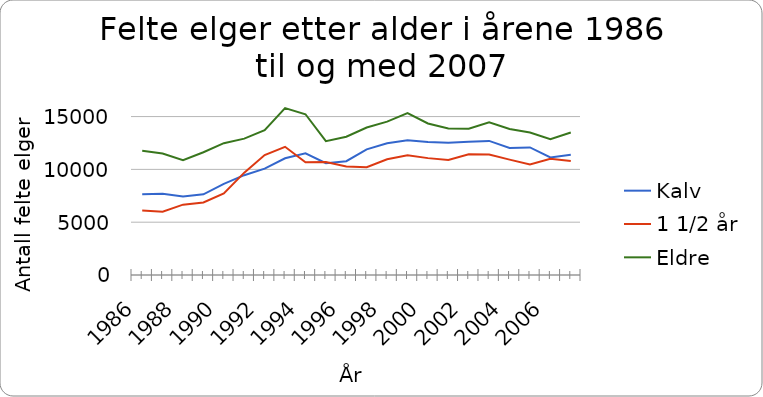
| Category | Kalv | 1 1/2 år | Eldre |
|---|---|---|---|
| 1986.0 | 7650 | 6104 | 11757 |
| 1987.0 | 7699 | 5999 | 11501 |
| 1988.0 | 7435 | 6659 | 10878 |
| 1989.0 | 7636 | 6870 | 11621 |
| 1990.0 | 8630 | 7731 | 12480 |
| 1991.0 | 9450 | 9693 | 12910 |
| 1992.0 | 10075 | 11352 | 13718 |
| 1993.0 | 11049 | 12135 | 15796 |
| 1994.0 | 11520 | 10664 | 15217 |
| 1995.0 | 10587 | 10698 | 12668 |
| 1996.0 | 10774 | 10279 | 13088 |
| 1997.0 | 11890 | 10205 | 13963 |
| 1998.0 | 12475 | 10962 | 14519 |
| 1999.0 | 12759 | 11332 | 15332 |
| 2000.0 | 12591 | 11065 | 14344 |
| 2001.0 | 12522 | 10899 | 13879 |
| 2002.0 | 12626 | 11422 | 13844 |
| 2003.0 | 12694 | 11417 | 14453 |
| 2004.0 | 12023 | 10921 | 13826 |
| 2005.0 | 12075 | 10469 | 13482 |
| 2006.0 | 11124 | 11008 | 12846 |
| 2007.0 | 11382 | 10785 | 13490 |